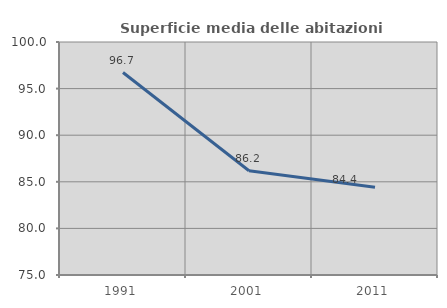
| Category | Superficie media delle abitazioni occupate |
|---|---|
| 1991.0 | 96.721 |
| 2001.0 | 86.192 |
| 2011.0 | 84.408 |